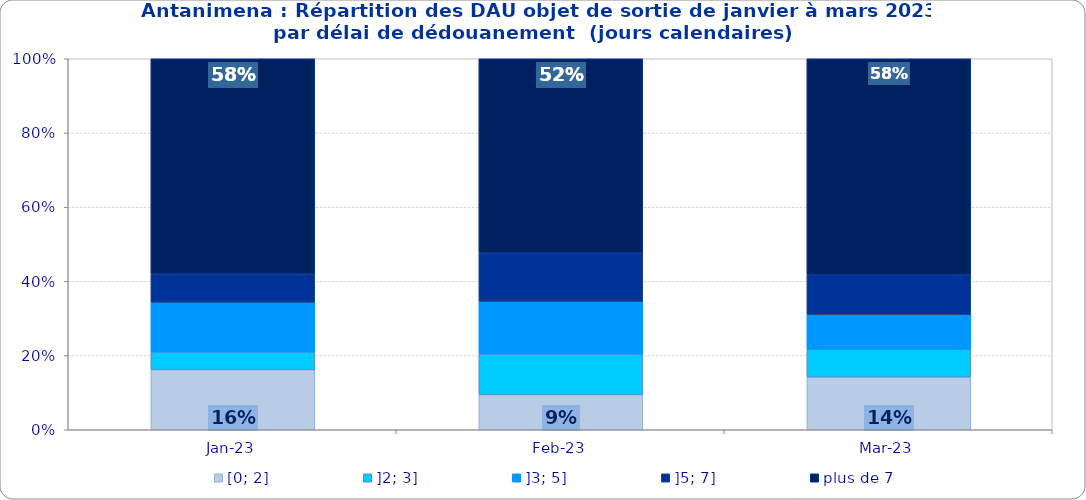
| Category | [0; 2] | ]2; 3] | ]3; 5] | ]5; 7] | plus de 7 |
|---|---|---|---|---|---|
| 2023-01-01 | 0.162 | 0.048 | 0.134 | 0.076 | 0.58 |
| 2023-02-01 | 0.095 | 0.109 | 0.142 | 0.131 | 0.523 |
| 2023-03-01 | 0.142 | 0.075 | 0.093 | 0.109 | 0.581 |